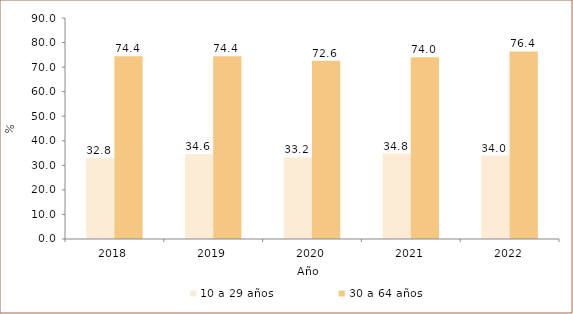
| Category | 10 a 29 años | 30 a 64 años |
|---|---|---|
| 2018.0 | 32.838 | 74.373 |
| 2019.0 | 34.604 | 74.433 |
| 2020.0 | 33.2 | 72.6 |
| 2021.0 | 34.8 | 74 |
| 2022.0 | 34 | 76.4 |